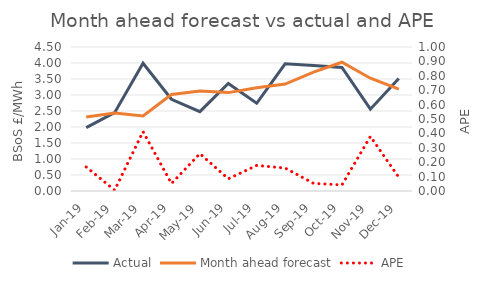
| Category | Actual | Month ahead forecast |
|---|---|---|
| Jan-19 | 1.98 | 2.31 |
| Feb-19 | 2.449 | 2.436 |
| Mar-19 | 3.992 | 2.347 |
| Apr-19 | 2.866 | 3.015 |
| May-19 | 2.481 | 3.125 |
| Jun-19 | 3.359 | 3.075 |
| Jul-19 | 2.742 | 3.228 |
| Aug-19 | 3.974 | 3.341 |
| Sep-19 | 3.923 | 3.715 |
| Oct-19 | 3.861 | 4.023 |
| Nov-19 | 2.556 | 3.525 |
| Dec-19 | 3.517 | 3.182 |